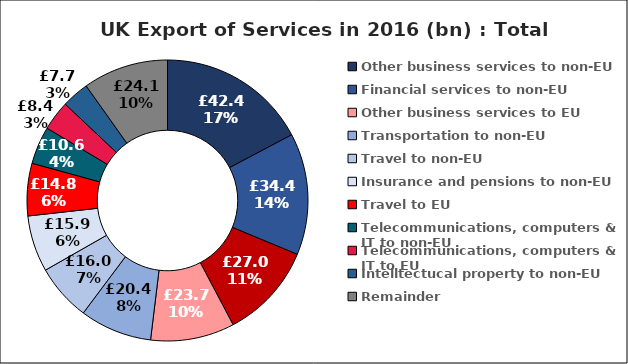
| Category | Series 0 |
|---|---|
| Other business services to non-EU | 42.35 |
| Financial services to non-EU | 34.362 |
| Financial services to EU | 27.021 |
| Other business services to EU | 23.7 |
| Transportation to non-EU | 20.378 |
| Travel to non-EU | 15.994 |
| Insurance and pensions to non-EU | 15.929 |
| Travel to EU | 14.8 |
| Telecommunications, computers & IT to non-EU | 10.641 |
| Telecommunications, computers & IT to EU | 8.395 |
| Intelltectucal property to non-EU | 7.734 |
| Remainder | 24.101 |